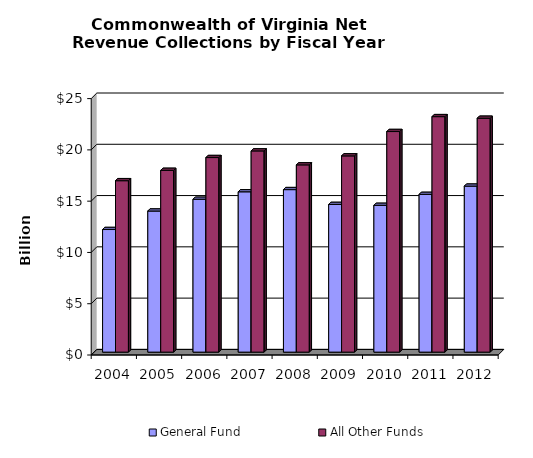
| Category | General Fund | All Other Funds |
|---|---|---|
| 2004.0 | 11.954 | 16.714 |
| 2005.0 | 13.755 | 17.723 |
| 2006.0 | 14.904 | 18.971 |
| 2007.0 | 15.633 | 19.618 |
| 2008.0 | 15.845 | 18.257 |
| 2009.0 | 14.398 | 19.134 |
| 2010.0 | 14.31 | 21.508 |
| 2011.0 | 15.379 | 22.96 |
| 2012.0 | 16.182 | 22.803 |